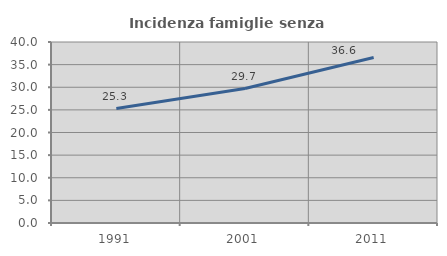
| Category | Incidenza famiglie senza nuclei |
|---|---|
| 1991.0 | 25.29 |
| 2001.0 | 29.723 |
| 2011.0 | 36.566 |